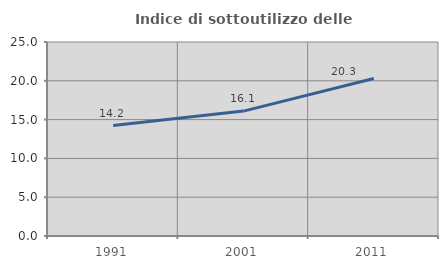
| Category | Indice di sottoutilizzo delle abitazioni  |
|---|---|
| 1991.0 | 14.231 |
| 2001.0 | 16.096 |
| 2011.0 | 20.306 |